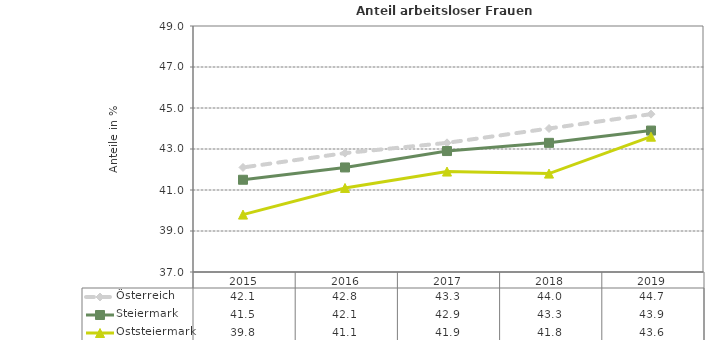
| Category | Österreich | Steiermark | Oststeiermark |
|---|---|---|---|
| 2019.0 | 44.7 | 43.9 | 43.6 |
| 2018.0 | 44 | 43.3 | 41.8 |
| 2017.0 | 43.3 | 42.9 | 41.9 |
| 2016.0 | 42.8 | 42.1 | 41.1 |
| 2015.0 | 42.1 | 41.5 | 39.8 |